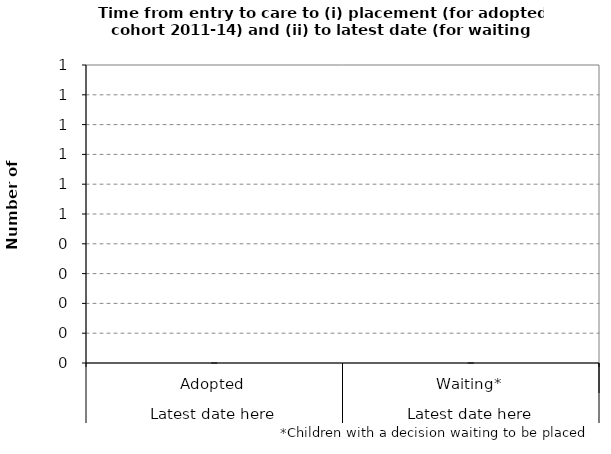
| Category | Series 1 | Series 2 | Series 3 |
|---|---|---|---|
| 0 | 0 | 0 | 0 |
| 1 | 0 | 0 | 0 |